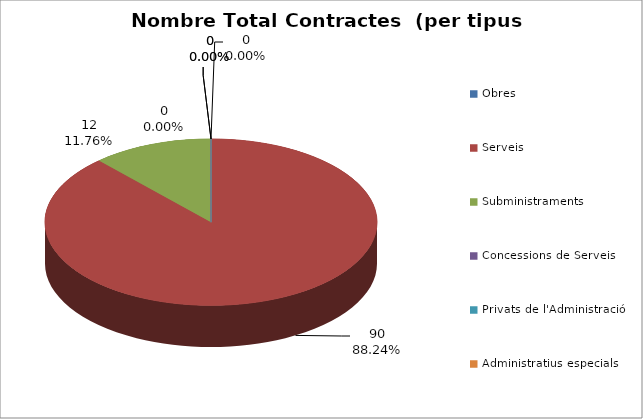
| Category | Nombre Total Contractes |
|---|---|
| Obres | 0 |
| Serveis | 90 |
| Subministraments | 12 |
| Concessions de Serveis | 0 |
| Privats de l'Administració | 0 |
| Administratius especials | 0 |